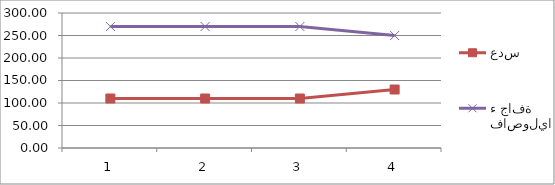
| Category | عدس | فاصولياء جافة |
|---|---|---|
| 0 | 110 | 270 |
| 1 | 110 | 270 |
| 2 | 110 | 270 |
| 3 | 130 | 250 |